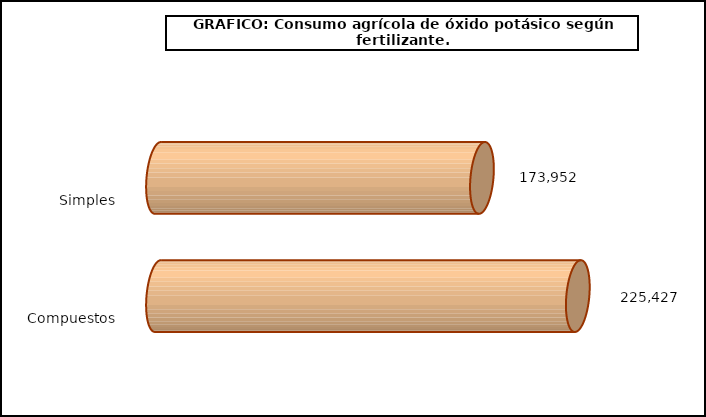
| Category | fert. N |
|---|---|
| 0 | 173952 |
| 1 | 225427 |